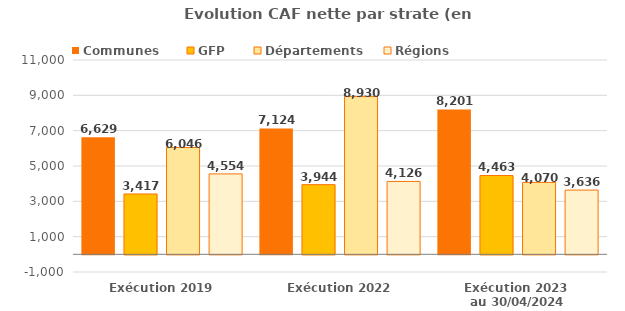
| Category | Communes  | GFP | Départements | Régions |
|---|---|---|---|---|
| Exécution 2019 | 6629.4 | 3416.6 | 6045.7 | 4554.1 |
| Exécution 2022 | 7123.6 | 3944.2 | 8930.2 | 4125.7 |
| Exécution 2023 
au 30/04/2024 | 8201.1 | 4462.7 | 4070 | 3636.1 |